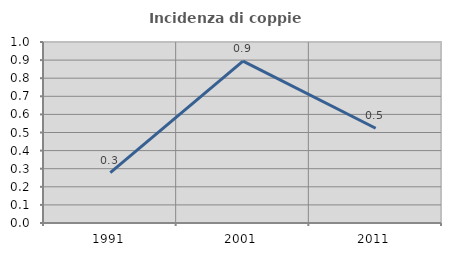
| Category | Incidenza di coppie miste |
|---|---|
| 1991.0 | 0.278 |
| 2001.0 | 0.894 |
| 2011.0 | 0.524 |